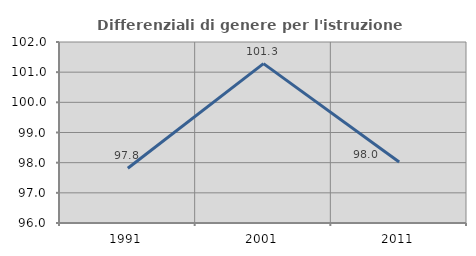
| Category | Differenziali di genere per l'istruzione superiore |
|---|---|
| 1991.0 | 97.817 |
| 2001.0 | 101.282 |
| 2011.0 | 98.023 |